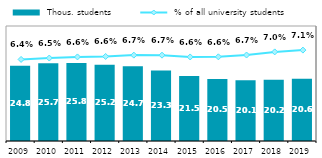
| Category |  Thous. students |
|---|---|
| 2009 | 24.83 |
| 2010 | 25.707 |
| 2011 | 25.794 |
| 2012 | 25.194 |
| 2013 | 24.721 |
| 2014 | 23.297 |
| 2015 | 21.469 |
| 2016 | 20.49 |
| 2017 | 20.099 |
| 2018 | 20.198 |
| 2019 | 20.552 |